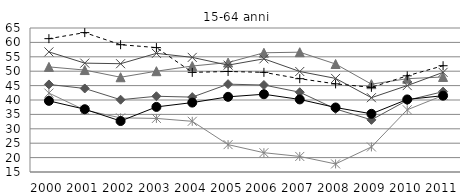
| Category | UE 27 | Germania | Grecia | Spagna | Francia | Italia |
|---|---|---|---|---|---|---|
| 2000 | 45.4 | 51.5 | 56.7 | 42.4 | 39.7 | 61.3 |
| 2001 | 44 | 50.4 | 52.8 | 36.5 | 36.8 | 63.4 |
| 2002 | 40.1 | 47.9 | 52.6 | 33.8 | 32.7 | 59.2 |
| 2003 | 41.3 | 50 | 56.2 | 33.6 | 37.6 | 58.2 |
| 2004 | 41 | 51.8 | 54.8 | 32.6 | 39.1 | 49.6 |
| 2005 | 45.5 | 53 | 52.1 | 24.5 | 41.1 | 49.9 |
| 2006 | 45.2 | 56.4 | 54.3 | 21.7 | 42 | 49.6 |
| 2007 | 42.7 | 56.6 | 49.9 | 20.4 | 40.2 | 47.4 |
| 2008 | 36.9 | 52.5 | 47.5 | 17.8 | 37.4 | 45.6 |
| 2009 | 33.1 | 45.5 | 40.8 | 23.7 | 35.2 | 44.4 |
| 2010 | 39.9 | 47.4 | 45 | 36.6 | 40.2 | 48.4 |
| 2011 | 42.9 | 48 | 49.6 | 41.6 | 41.5 | 51.9 |